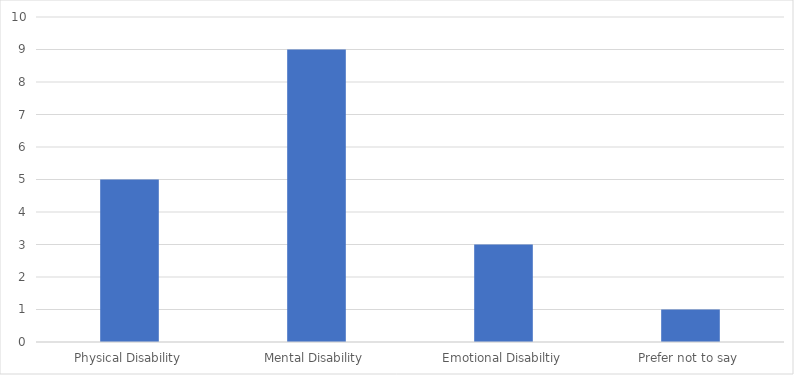
| Category | Number of Responses |
|---|---|
| Physical Disability | 5 |
| Mental Disability | 9 |
| Emotional Disabiltiy | 3 |
| Prefer not to say | 1 |